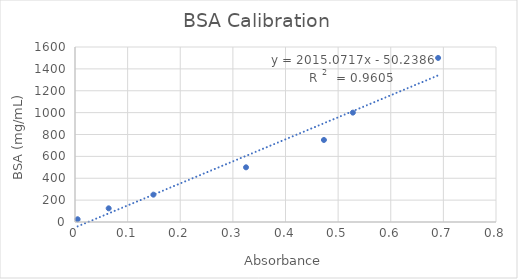
| Category | Series 0 |
|---|---|
| 0.69 | 1500 |
| 0.528 | 1000 |
| 0.47300000000000003 | 750 |
| 0.325 | 500 |
| 0.14900000000000002 | 250 |
| 0.064 | 125 |
| 0.0050000000000000044 | 25 |